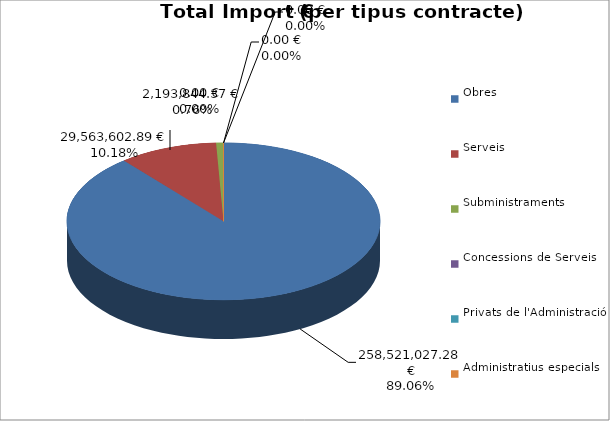
| Category | Total preu
(amb IVA) |
|---|---|
| Obres | 258521027.276 |
| Serveis | 29563602.886 |
| Subministraments | 2193844.373 |
| Concessions de Serveis | 0 |
| Privats de l'Administració | 0 |
| Administratius especials | 0 |